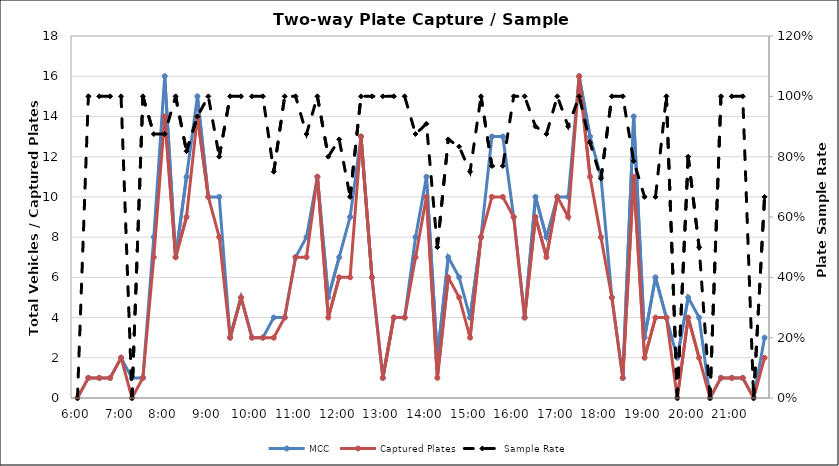
| Category | MCC | Captured Plates |
|---|---|---|
| 0.25 | 0 | 0 |
| 0.260416666666667 | 1 | 1 |
| 0.270833333333333 | 1 | 1 |
| 0.28125 | 1 | 1 |
| 0.291666666666667 | 2 | 2 |
| 0.302083333333333 | 1 | 0 |
| 0.3125 | 1 | 1 |
| 0.322916666666667 | 8 | 7 |
| 0.333333333333333 | 16 | 14 |
| 0.34375 | 7 | 7 |
| 0.354166666666667 | 11 | 9 |
| 0.364583333333333 | 15 | 14 |
| 0.375 | 10 | 10 |
| 0.385416666666667 | 10 | 8 |
| 0.395833333333333 | 3 | 3 |
| 0.40625 | 5 | 5 |
| 0.416666666666667 | 3 | 3 |
| 0.427083333333333 | 3 | 3 |
| 0.4375 | 4 | 3 |
| 0.447916666666667 | 4 | 4 |
| 0.458333333333333 | 7 | 7 |
| 0.46875 | 8 | 7 |
| 0.479166666666667 | 11 | 11 |
| 0.489583333333333 | 5 | 4 |
| 0.5 | 7 | 6 |
| 0.510416666666667 | 9 | 6 |
| 0.520833333333333 | 13 | 13 |
| 0.53125 | 6 | 6 |
| 0.541666666666667 | 1 | 1 |
| 0.552083333333333 | 4 | 4 |
| 0.5625 | 4 | 4 |
| 0.572916666666667 | 8 | 7 |
| 0.583333333333333 | 11 | 10 |
| 0.59375 | 2 | 1 |
| 0.604166666666667 | 7 | 6 |
| 0.614583333333333 | 6 | 5 |
| 0.625 | 4 | 3 |
| 0.635416666666667 | 8 | 8 |
| 0.645833333333333 | 13 | 10 |
| 0.65625 | 13 | 10 |
| 0.666666666666667 | 9 | 9 |
| 0.677083333333333 | 4 | 4 |
| 0.6875 | 10 | 9 |
| 0.697916666666667 | 8 | 7 |
| 0.708333333333333 | 10 | 10 |
| 0.71875 | 10 | 9 |
| 0.729166666666667 | 16 | 16 |
| 0.739583333333333 | 13 | 11 |
| 0.75 | 11 | 8 |
| 0.760416666666667 | 5 | 5 |
| 0.770833333333333 | 1 | 1 |
| 0.78125 | 14 | 11 |
| 0.791666666666667 | 3 | 2 |
| 0.802083333333333 | 6 | 4 |
| 0.8125 | 4 | 4 |
| 0.822916666666667 | 2 | 0 |
| 0.833333333333333 | 5 | 4 |
| 0.84375 | 4 | 2 |
| 0.854166666666667 | 0 | 0 |
| 0.864583333333333 | 1 | 1 |
| 0.875 | 1 | 1 |
| 0.885416666666667 | 1 | 1 |
| 0.895833333333333 | 0 | 0 |
| 0.90625 | 3 | 2 |